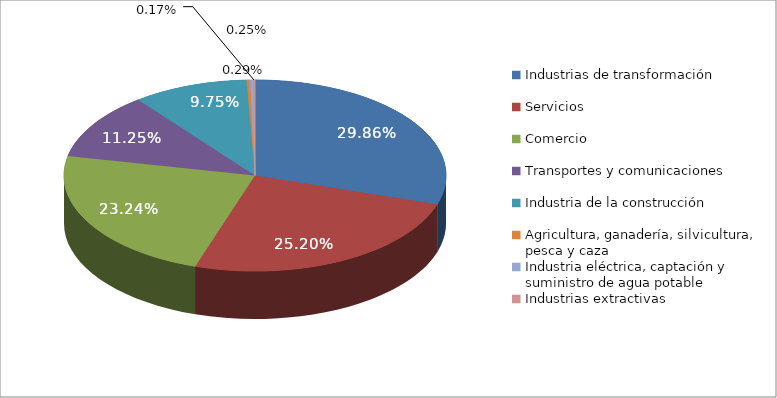
| Category | Series 0 |
|---|---|
| Industrias de transformación | 32953 |
| Servicios | 27808 |
| Comercio | 25647 |
| Transportes y comunicaciones | 12416 |
| Industria de la construcción | 10762 |
| Agricultura, ganadería, silvicultura, pesca y caza | 316 |
| Industria eléctrica, captación y suministro de agua potable | 271 |
| Industrias extractivas | 190 |